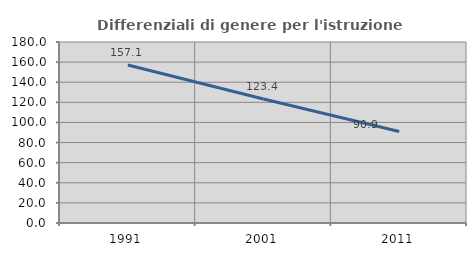
| Category | Differenziali di genere per l'istruzione superiore |
|---|---|
| 1991.0 | 157.106 |
| 2001.0 | 123.38 |
| 2011.0 | 90.941 |